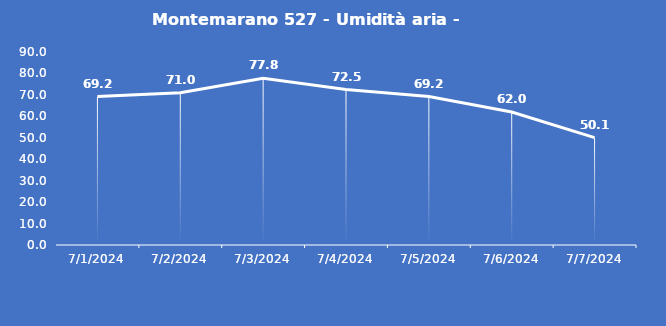
| Category | Montemarano 527 - Umidità aria - Grezzo (%) |
|---|---|
| 7/1/24 | 69.2 |
| 7/2/24 | 71 |
| 7/3/24 | 77.8 |
| 7/4/24 | 72.5 |
| 7/5/24 | 69.2 |
| 7/6/24 | 62 |
| 7/7/24 | 50.1 |